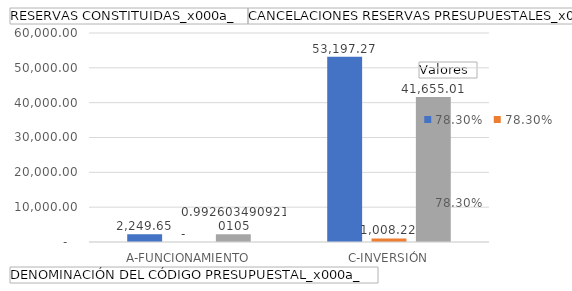
| Category | RESERVAS CONSTITUIDAS
 | CANCELACIONES RESERVAS PRESUPUESTALES
  | PAGOS
ACUMULADOS
 |
|---|---|---|---|
| A-FUNCIONAMIENTO | 2249.649 | 0 | 2233.009 |
| C-INVERSIÓN | 53197.266 | 1008.219 | 41655.009 |